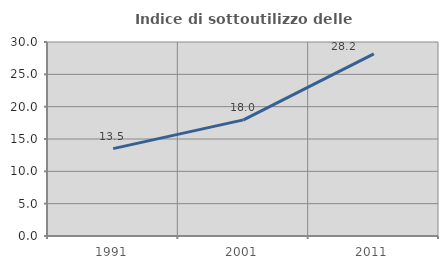
| Category | Indice di sottoutilizzo delle abitazioni  |
|---|---|
| 1991.0 | 13.512 |
| 2001.0 | 17.961 |
| 2011.0 | 28.166 |